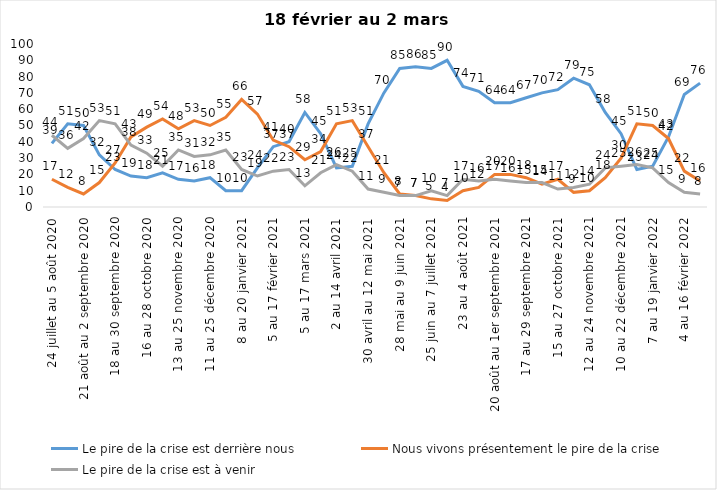
| Category | Le pire de la crise est derrière nous | Nous vivons présentement le pire de la crise | Le pire de la crise est à venir |
|---|---|---|---|
| 24 juillet au 5 août 2020 | 39 | 17 | 44 |
| 7 au 19 août 2020 | 51 | 12 | 36 |
| 21 août au 2 septembre 2020 | 50 | 8 | 42 |
| 4 au 16 septembre 2020 | 32 | 15 | 53 |
| 18 au 30 septembre 2020 | 23 | 27 | 51 |
| 2 au 14 octobre 2020 | 19 | 43 | 38 |
| 16 au 28 octobre 2020 | 18 | 49 | 33 |
| 30 octobre au 11 novembre 2020 | 21 | 54 | 25 |
| 13 au 25 novembre 2020 | 17 | 48 | 35 |
| 27 au 9 décembre 2020 | 16 | 53 | 31 |
| 11 au 25 décembre 2020 | 18 | 50 | 32 |
| 25 décembre 2020 au 6 janvier 2021 | 10 | 55 | 35 |
| 8 au 20 janvier 2021 | 10 | 66 | 23 |
| 22 janvier au 3 février 2021 | 24 | 57 | 19 |
| 5 au 17 février 2021 | 37 | 41 | 22 |
| 19 février au 3 mars 2021 | 40 | 37 | 23 |
| 5 au 17 mars 2021 | 58 | 29 | 13 |
| 19 au 31 mars 2021 | 45 | 34 | 21 |
| 2 au 14 avril 2021 | 24 | 51 | 26 |
| 16 au 28 avril 2021 | 25 | 53 | 22 |
| 30 avril au 12 mai 2021 | 51 | 37 | 11 |
| 14 au 26 mai 2021 | 70 | 21 | 9 |
| 28 mai au 9 juin 2021 | 85 | 8 | 7 |
| 11 au 23 juin 2021 | 86 | 7 | 7 |
| 25 juin au 7 juillet 2021 | 85 | 5 | 10 |
| 9 au 21 juillet 2021 | 90 | 4 | 7 |
| 23 au 4 août 2021 | 74 | 10 | 17 |
| 6 au 18 août 2021 | 71 | 12 | 16 |
| 20 août au 1er septembre 2021 | 64 | 20 | 17 |
| 3 au 15 septembre 2021 | 64 | 20 | 16 |
| 17 au 29 septembre 2021 | 67 | 18 | 15 |
| 1 au 13 octobre 2021 | 70 | 14 | 15 |
| 15 au 27 octobre 2021 | 72 | 17 | 11 |
| 29 octobre au 10 novembre 2021 | 79 | 9 | 12 |
| 12 au 24 novembre 2021 | 75 | 10 | 14 |
| 26 novembre au 8 décembre 2021 | 58 | 18 | 24 |
| 10 au 22 décembre 2021 | 45 | 30 | 25 |
| 24 décembre 2021 au 5 janvier 2022 2022 | 23 | 51 | 26 |
| 7 au 19 janvier 2022 | 25 | 50 | 24 |
| 21 janvier au 2 février 2022 | 43 | 42 | 15 |
| 4 au 16 février 2022 | 69 | 22 | 9 |
| 18 février au 2 mars  2022 | 76 | 16 | 8 |